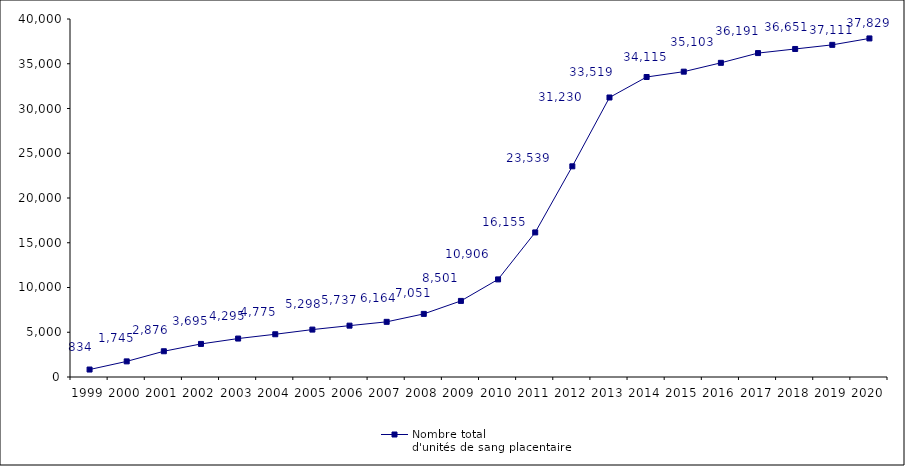
| Category | Nombre total
d'unités de sang placentaire |
|---|---|
| 1999.0 | 834 |
| 2000.0 | 1745 |
| 2001.0 | 2876 |
| 2002.0 | 3695 |
| 2003.0 | 4295 |
| 2004.0 | 4775 |
| 2005.0 | 5298 |
| 2006.0 | 5737 |
| 2007.0 | 6164 |
| 2008.0 | 7051 |
| 2009.0 | 8501 |
| 2010.0 | 10906 |
| 2011.0 | 16155 |
| 2012.0 | 23539 |
| 2013.0 | 31230 |
| 2014.0 | 33519 |
| 2015.0 | 34115 |
| 2016.0 | 35103 |
| 2017.0 | 36191 |
| 2018.0 | 36651 |
| 2019.0 | 37111 |
| 2020.0 | 37829 |